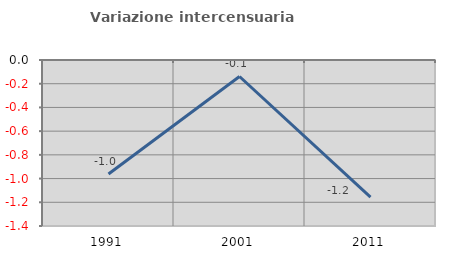
| Category | Variazione intercensuaria annua |
|---|---|
| 1991.0 | -0.961 |
| 2001.0 | -0.139 |
| 2011.0 | -1.156 |